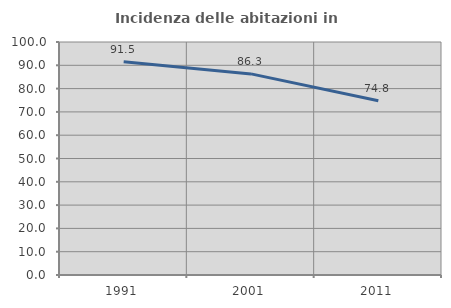
| Category | Incidenza delle abitazioni in proprietà  |
|---|---|
| 1991.0 | 91.518 |
| 2001.0 | 86.313 |
| 2011.0 | 74.795 |